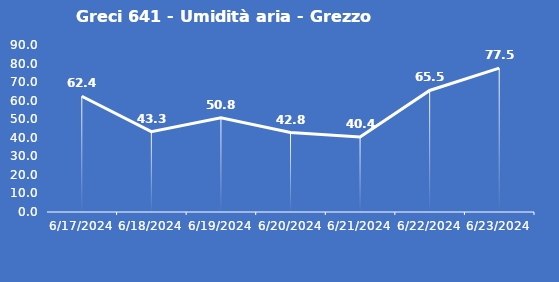
| Category | Greci 641 - Umidità aria - Grezzo (%) |
|---|---|
| 6/17/24 | 62.4 |
| 6/18/24 | 43.3 |
| 6/19/24 | 50.8 |
| 6/20/24 | 42.8 |
| 6/21/24 | 40.4 |
| 6/22/24 | 65.5 |
| 6/23/24 | 77.5 |